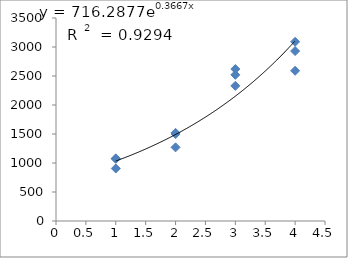
| Category | Series 0 |
|---|---|
| 1.0 | 1080 |
| 1.0 | 905 |
| 1.0 | 1070 |
| 2.0 | 1520 |
| 2.0 | 1500 |
| 2.0 | 1270 |
| 3.0 | 2330 |
| 3.0 | 2620 |
| 3.0 | 2520 |
| 4.0 | 2590 |
| 4.0 | 3090 |
| 4.0 | 2930 |